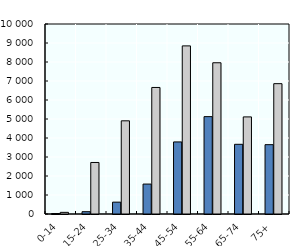
| Category | Mental and behavioural disorders | Suicide |
|---|---|---|
| 0-14 | 25 | 87 |
| 15-24 | 121 | 2712 |
| 25-34 | 624 | 4904 |
| 35-44 | 1575 | 6660 |
| 45-54 | 3793 | 8848 |
| 55-64 | 5125 | 7960 |
| 65-74 | 3668 | 5111 |
| 75+ | 3649 | 6860 |